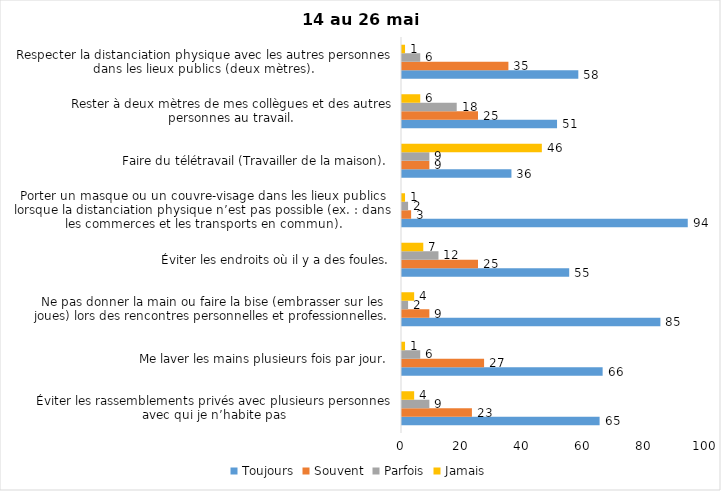
| Category | Toujours | Souvent | Parfois | Jamais |
|---|---|---|---|---|
| Éviter les rassemblements privés avec plusieurs personnes avec qui je n’habite pas | 65 | 23 | 9 | 4 |
| Me laver les mains plusieurs fois par jour. | 66 | 27 | 6 | 1 |
| Ne pas donner la main ou faire la bise (embrasser sur les joues) lors des rencontres personnelles et professionnelles. | 85 | 9 | 2 | 4 |
| Éviter les endroits où il y a des foules. | 55 | 25 | 12 | 7 |
| Porter un masque ou un couvre-visage dans les lieux publics lorsque la distanciation physique n’est pas possible (ex. : dans les commerces et les transports en commun). | 94 | 3 | 2 | 1 |
| Faire du télétravail (Travailler de la maison). | 36 | 9 | 9 | 46 |
| Rester à deux mètres de mes collègues et des autres personnes au travail. | 51 | 25 | 18 | 6 |
| Respecter la distanciation physique avec les autres personnes dans les lieux publics (deux mètres). | 58 | 35 | 6 | 1 |